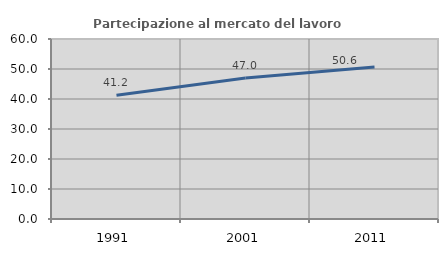
| Category | Partecipazione al mercato del lavoro  femminile |
|---|---|
| 1991.0 | 41.231 |
| 2001.0 | 47.008 |
| 2011.0 | 50.647 |